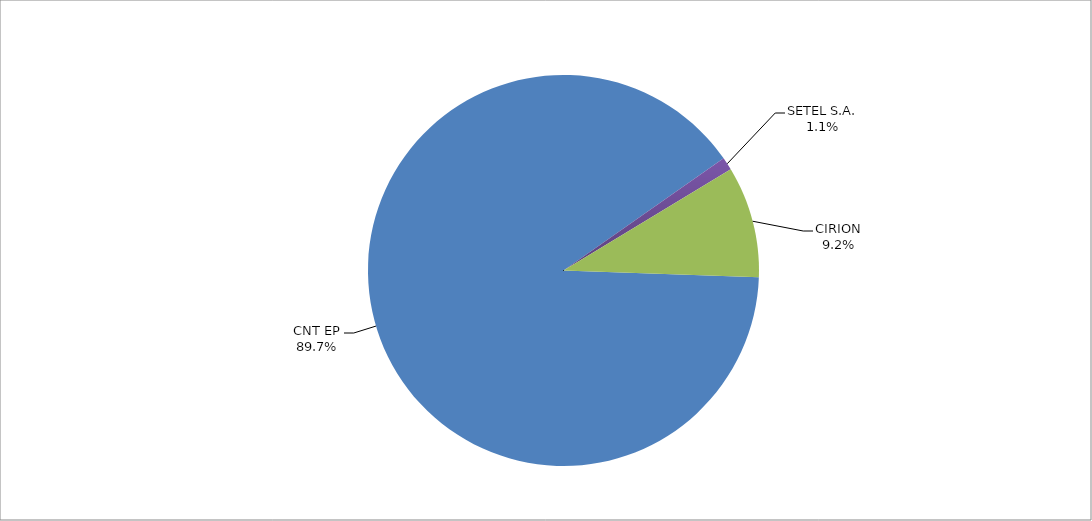
| Category | Series 0 |
|---|---|
| CNT EP | 253 |
| SETEL S.A. | 3 |
| CIRION | 26 |